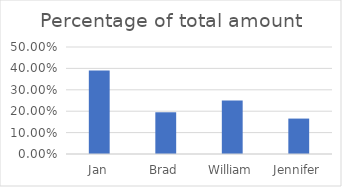
| Category | Percentage of total amount |
|---|---|
| Jan | 0.39 |
| Brad | 0.195 |
| William | 0.25 |
| Jennifer | 0.166 |